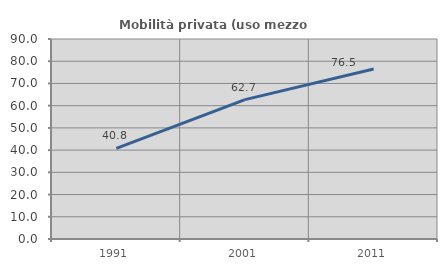
| Category | Mobilità privata (uso mezzo privato) |
|---|---|
| 1991.0 | 40.803 |
| 2001.0 | 62.712 |
| 2011.0 | 76.471 |